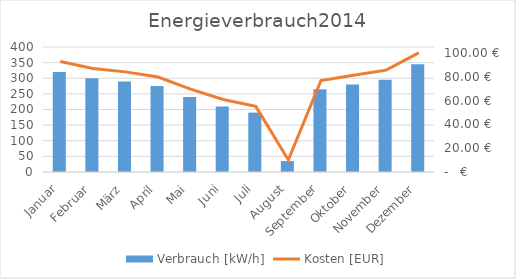
| Category | Verbrauch [kW/h] |
|---|---|
| Januar | 320 |
| Februar | 300 |
| März | 290 |
| April | 275 |
| Mai | 240 |
| Juni | 210 |
| Juli | 190 |
| August | 35 |
| September | 265 |
| Oktober | 280 |
| November | 295 |
| Dezember | 345 |